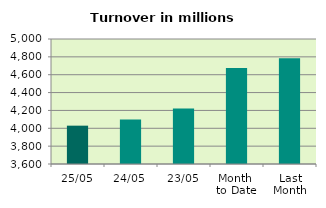
| Category | Series 0 |
|---|---|
| 25/05 | 4029.365 |
| 24/05 | 4099.175 |
| 23/05 | 4222.679 |
| Month 
to Date | 4675.769 |
| Last
Month | 4785.141 |